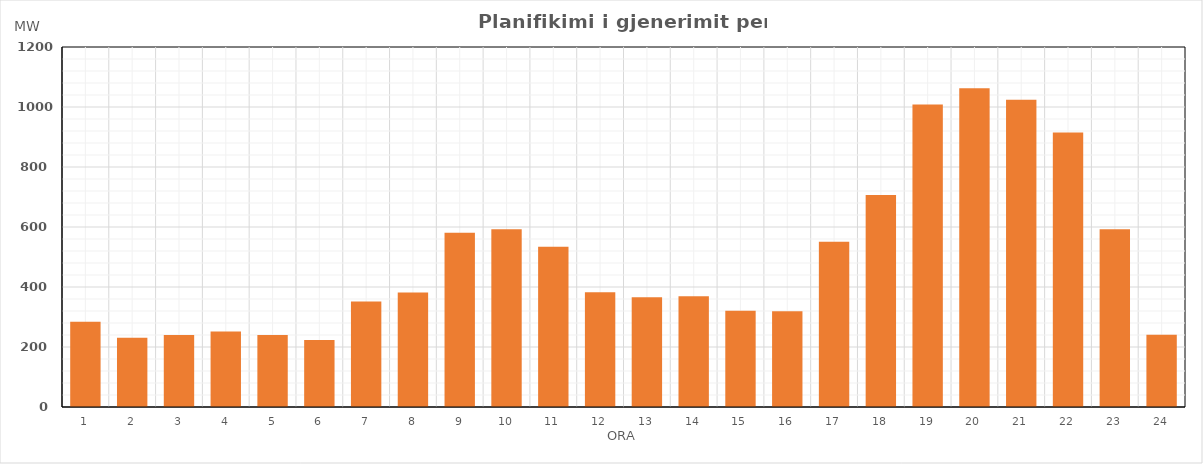
| Category | Max (MW) |
|---|---|
| 0 | 284.222 |
| 1 | 230.954 |
| 2 | 239.592 |
| 3 | 251.928 |
| 4 | 240.094 |
| 5 | 223.711 |
| 6 | 352.076 |
| 7 | 381.451 |
| 8 | 580.852 |
| 9 | 592.863 |
| 10 | 534.5 |
| 11 | 382.114 |
| 12 | 365.905 |
| 13 | 369.392 |
| 14 | 321.033 |
| 15 | 319.056 |
| 16 | 550.807 |
| 17 | 707.082 |
| 18 | 1008.102 |
| 19 | 1062.866 |
| 20 | 1024.484 |
| 21 | 914.847 |
| 22 | 592.422 |
| 23 | 240.757 |